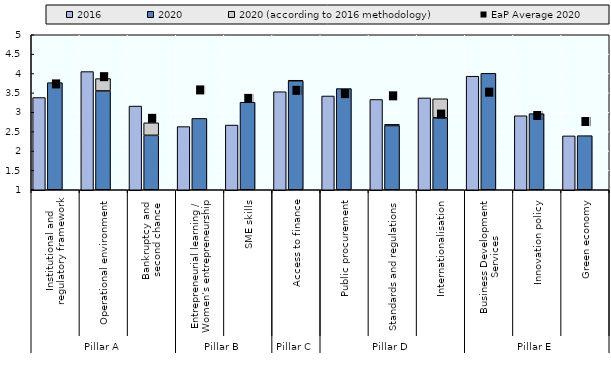
| Category | 2020 | 2020 (according to 2016 methodology) |
|---|---|---|
| 0 | 3.764 | 0 |
| 1 | 3.55 | 0.318 |
| 2 | 2.405 | 0.323 |
| 3 | 2.841 | 0 |
| 4 | 3.259 | 0 |
| 5 | 3.809 | 0.017 |
| 6 | 3.611 | 0 |
| 7 | 2.658 | 0.03 |
| 8 | 2.859 | 0.49 |
| 9 | 4.005 | 0 |
| 10 | 2.964 | 0 |
| 11 | 2.396 | 0 |